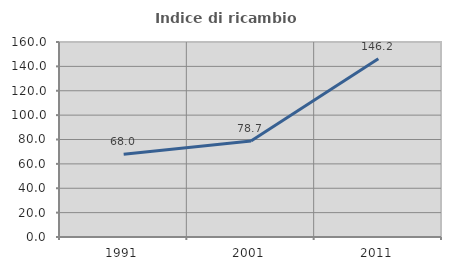
| Category | Indice di ricambio occupazionale  |
|---|---|
| 1991.0 | 67.954 |
| 2001.0 | 78.723 |
| 2011.0 | 146.243 |